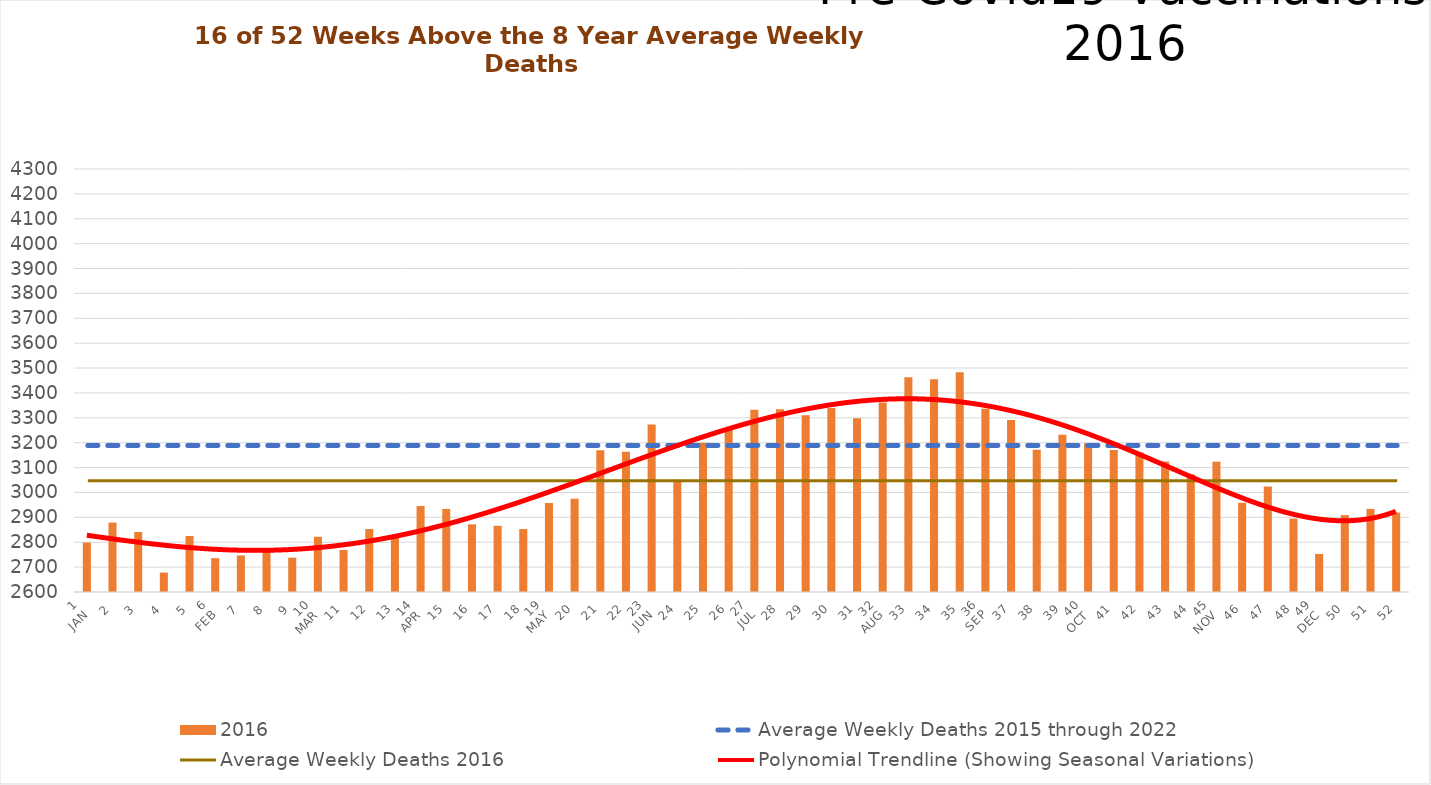
| Category | 2016 |
|---|---|
| 1
JAN | 2799 |
| 2 | 2879 |
| 3 | 2841 |
| 4 | 2678 |
| 5 | 2825 |
| 6
FEB | 2736 |
| 7 | 2747 |
| 8 | 2773 |
| 9 | 2738 |
| 10
MAR | 2822 |
| 11 | 2769 |
| 12 | 2853 |
| 13 | 2829 |
| 14
APR | 2946 |
| 15 | 2934 |
| 16 | 2872 |
| 17 | 2866 |
| 18 | 2853 |
| 19
MAY | 2958 |
| 20 | 2975 |
| 21 | 3170 |
| 22 | 3164 |
| 23
JUN | 3273 |
| 24 | 3051 |
| 25 | 3200 |
| 26 | 3253 |
| 27
JUL | 3332 |
| 28 | 3334 |
| 29 | 3310 |
| 30 | 3339 |
| 31 | 3298 |
| 32
AUG | 3362 |
| 33 | 3463 |
| 34 | 3455 |
| 35 | 3483 |
| 36
SEP | 3336 |
| 37 | 3291 |
| 38 | 3172 |
| 39 | 3232 |
| 40
OCT | 3198 |
| 41 | 3171 |
| 42 | 3161 |
| 43 | 3124 |
| 44 | 3073 |
| 45
NOV | 3123 |
| 46 | 2959 |
| 47 | 3024 |
| 48 | 2895 |
| 49
DEC | 2753 |
| 50 | 2909 |
| 51 | 2934 |
| 52 | 2919 |